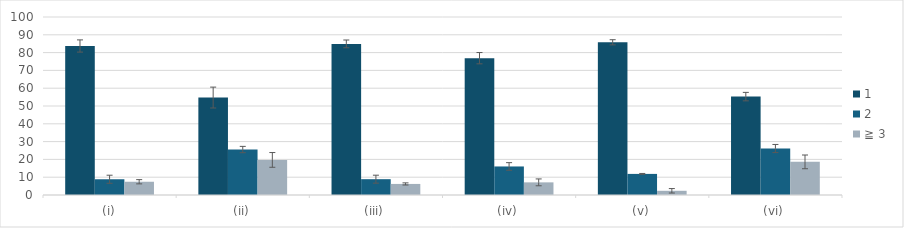
| Category | 1 | 2 | ≧ 3 |
|---|---|---|---|
| (i) | 83.706 | 8.85 | 7.444 |
| (ii) | 54.747 | 25.536 | 19.717 |
| (iii) | 84.896 | 8.887 | 6.216 |
| (iv) | 76.865 | 16.033 | 7.102 |
| (v) | 85.789 | 11.849 | 2.362 |
| (vi) | 55.273 | 26.116 | 18.611 |